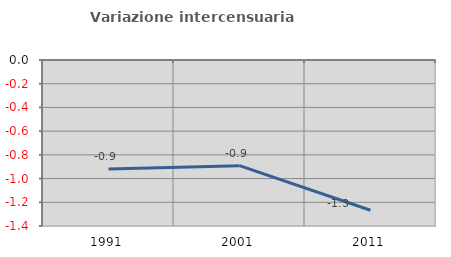
| Category | Variazione intercensuaria annua |
|---|---|
| 1991.0 | -0.92 |
| 2001.0 | -0.891 |
| 2011.0 | -1.268 |